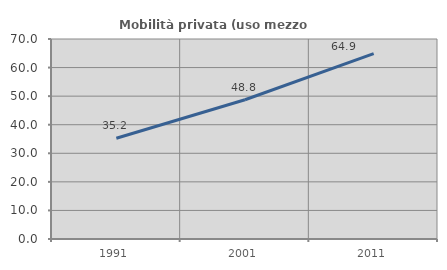
| Category | Mobilità privata (uso mezzo privato) |
|---|---|
| 1991.0 | 35.246 |
| 2001.0 | 48.75 |
| 2011.0 | 64.865 |